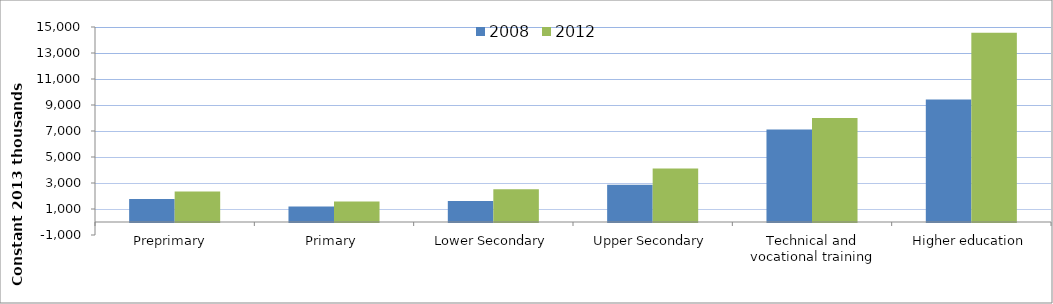
| Category | 2008 | 2012 |
|---|---|---|
| Preprimary  | 1770.364 | 2337.177 |
| Primary  | 1198.38 | 1571.858 |
| Lower Secondary | 1610.627 | 2517.559 |
| Upper Secondary | 2866.265 | 4118.405 |
| Technical and vocational training | 7108.213 | 7991.453 |
| Higher education | 9421.101 | 14554.041 |